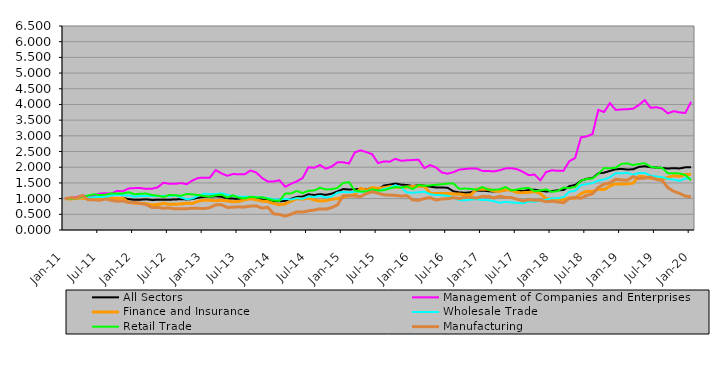
| Category | All Sectors | Management of Companies and Enterprises | Finance and Insurance | Wholesale Trade | Retail Trade | Manufacturing |
|---|---|---|---|---|---|---|
| 2011-01-01 | 1 | 1 | 1 | 1 | 1 | 1 |
| 2011-02-01 | 1.002 | 1.02 | 0.988 | 1.011 | 0.996 | 1.026 |
| 2011-03-01 | 1.011 | 1.051 | 1.008 | 1.012 | 1.012 | 1.017 |
| 2011-04-01 | 1.046 | 1.098 | 1.013 | 1.051 | 1.061 | 1.1 |
| 2011-05-01 | 1.016 | 1.076 | 0.989 | 1.028 | 1.096 | 0.963 |
| 2011-06-01 | 1.03 | 1.107 | 1.009 | 1.043 | 1.136 | 0.961 |
| 2011-07-01 | 1.03 | 1.16 | 0.998 | 1.056 | 1.114 | 0.945 |
| 2011-08-01 | 1.028 | 1.173 | 0.996 | 1.044 | 1.125 | 0.991 |
| 2011-09-01 | 1.021 | 1.157 | 1.015 | 1.102 | 1.164 | 0.946 |
| 2011-10-01 | 1.022 | 1.247 | 0.999 | 1.129 | 1.164 | 0.915 |
| 2011-11-01 | 1.022 | 1.233 | 1.011 | 1.105 | 1.163 | 0.927 |
| 2011-12-01 | 0.981 | 1.324 | 0.883 | 1.101 | 1.201 | 0.876 |
| 2012-01-01 | 0.963 | 1.335 | 0.855 | 1.065 | 1.138 | 0.88 |
| 2012-02-01 | 0.965 | 1.338 | 0.849 | 1.088 | 1.155 | 0.846 |
| 2012-03-01 | 0.977 | 1.31 | 0.836 | 1.084 | 1.161 | 0.815 |
| 2012-04-01 | 0.958 | 1.315 | 0.803 | 1.079 | 1.113 | 0.718 |
| 2012-05-01 | 0.962 | 1.359 | 0.811 | 1.081 | 1.096 | 0.722 |
| 2012-06-01 | 0.968 | 1.508 | 0.85 | 1.089 | 1.054 | 0.694 |
| 2012-07-01 | 0.964 | 1.473 | 0.817 | 1.077 | 1.116 | 0.704 |
| 2012-08-01 | 0.972 | 1.47 | 0.822 | 1.106 | 1.109 | 0.675 |
| 2012-09-01 | 0.982 | 1.495 | 0.827 | 1.04 | 1.091 | 0.679 |
| 2012-10-01 | 0.974 | 1.458 | 0.854 | 0.98 | 1.148 | 0.678 |
| 2012-11-01 | 0.987 | 1.577 | 0.846 | 1.004 | 1.136 | 0.694 |
| 2012-12-01 | 1.033 | 1.66 | 0.917 | 1.089 | 1.114 | 0.69 |
| 2013-01-01 | 1.055 | 1.664 | 0.949 | 1.158 | 1.083 | 0.681 |
| 2013-02-01 | 1.059 | 1.669 | 0.949 | 1.146 | 1.057 | 0.714 |
| 2013-03-01 | 1.077 | 1.91 | 0.93 | 1.148 | 1.105 | 0.8 |
| 2013-04-01 | 1.059 | 1.803 | 0.951 | 1.169 | 1.127 | 0.807 |
| 2013-05-01 | 1.009 | 1.727 | 0.926 | 1.125 | 1.036 | 0.718 |
| 2013-06-01 | 1.001 | 1.785 | 0.896 | 1.08 | 1.105 | 0.727 |
| 2013-07-01 | 0.992 | 1.774 | 0.907 | 1.064 | 1.029 | 0.738 |
| 2013-08-01 | 1.006 | 1.773 | 0.961 | 1.057 | 1.006 | 0.733 |
| 2013-09-01 | 1.036 | 1.897 | 0.993 | 1.059 | 1.056 | 0.762 |
| 2013-10-01 | 1.017 | 1.832 | 0.965 | 1.049 | 1.037 | 0.769 |
| 2013-11-01 | 0.979 | 1.658 | 0.918 | 1.036 | 1.043 | 0.698 |
| 2013-12-01 | 0.966 | 1.541 | 0.908 | 1.014 | 0.993 | 0.725 |
| 2014-01-01 | 0.914 | 1.544 | 0.844 | 0.976 | 0.939 | 0.516 |
| 2014-02-01 | 0.912 | 1.586 | 0.802 | 0.966 | 0.925 | 0.495 |
| 2014-03-01 | 0.93 | 1.376 | 0.832 | 0.991 | 1.159 | 0.442 |
| 2014-04-01 | 0.993 | 1.472 | 0.921 | 0.972 | 1.166 | 0.501 |
| 2014-05-01 | 1.054 | 1.55 | 1.001 | 1.015 | 1.244 | 0.578 |
| 2014-06-01 | 1.065 | 1.656 | 0.98 | 0.994 | 1.176 | 0.571 |
| 2014-07-01 | 1.138 | 1.998 | 1.023 | 1.067 | 1.251 | 0.612 |
| 2014-08-01 | 1.114 | 1.983 | 0.956 | 1.055 | 1.257 | 0.635 |
| 2014-09-01 | 1.142 | 2.071 | 0.923 | 1.09 | 1.345 | 0.674 |
| 2014-10-01 | 1.12 | 1.951 | 0.935 | 1.035 | 1.293 | 0.664 |
| 2014-11-01 | 1.156 | 2.021 | 0.98 | 1.066 | 1.298 | 0.714 |
| 2014-12-01 | 1.227 | 2.156 | 0.999 | 1.192 | 1.341 | 0.802 |
| 2015-01-01 | 1.305 | 2.157 | 1.047 | 1.213 | 1.502 | 1.092 |
| 2015-02-01 | 1.29 | 2.118 | 1.088 | 1.202 | 1.522 | 1.096 |
| 2015-03-01 | 1.299 | 2.473 | 1.129 | 1.22 | 1.26 | 1.084 |
| 2015-04-01 | 1.308 | 2.539 | 1.325 | 1.216 | 1.229 | 1.064 |
| 2015-05-01 | 1.301 | 2.483 | 1.272 | 1.234 | 1.222 | 1.162 |
| 2015-06-01 | 1.338 | 2.414 | 1.353 | 1.275 | 1.297 | 1.218 |
| 2015-07-01 | 1.29 | 2.132 | 1.329 | 1.24 | 1.259 | 1.176 |
| 2015-08-01 | 1.417 | 2.185 | 1.346 | 1.307 | 1.265 | 1.12 |
| 2015-09-01 | 1.444 | 2.176 | 1.381 | 1.346 | 1.321 | 1.114 |
| 2015-10-01 | 1.479 | 2.267 | 1.371 | 1.427 | 1.367 | 1.102 |
| 2015-11-01 | 1.446 | 2.205 | 1.349 | 1.351 | 1.354 | 1.083 |
| 2015-12-01 | 1.433 | 2.221 | 1.369 | 1.194 | 1.387 | 1.091 |
| 2016-01-01 | 1.4 | 2.229 | 1.387 | 1.188 | 1.302 | 0.956 |
| 2016-02-01 | 1.429 | 2.24 | 1.393 | 1.203 | 1.431 | 0.948 |
| 2016-03-01 | 1.413 | 1.973 | 1.39 | 1.219 | 1.407 | 1.003 |
| 2016-04-01 | 1.379 | 2.07 | 1.171 | 1.143 | 1.423 | 1.033 |
| 2016-05-01 | 1.356 | 1.992 | 1.159 | 1.113 | 1.44 | 0.954 |
| 2016-06-01 | 1.354 | 1.834 | 1.165 | 1.11 | 1.457 | 0.989 |
| 2016-07-01 | 1.348 | 1.793 | 1.166 | 1.091 | 1.478 | 0.998 |
| 2016-08-01 | 1.233 | 1.841 | 1.149 | 1.035 | 1.482 | 1.031 |
| 2016-09-01 | 1.197 | 1.923 | 1.148 | 0.957 | 1.312 | 1.002 |
| 2016-10-01 | 1.185 | 1.944 | 1.119 | 0.945 | 1.321 | 1.043 |
| 2016-11-01 | 1.201 | 1.962 | 1.118 | 0.969 | 1.309 | 1.039 |
| 2016-12-01 | 1.255 | 1.958 | 1.301 | 0.983 | 1.285 | 1.018 |
| 2017-01-01 | 1.254 | 1.882 | 1.299 | 0.953 | 1.37 | 1.072 |
| 2017-02-01 | 1.238 | 1.881 | 1.296 | 0.952 | 1.288 | 1.07 |
| 2017-03-01 | 1.223 | 1.866 | 1.24 | 0.918 | 1.28 | 1.021 |
| 2017-04-01 | 1.246 | 1.905 | 1.232 | 0.868 | 1.296 | 1.076 |
| 2017-05-01 | 1.271 | 1.963 | 1.278 | 0.898 | 1.368 | 1.039 |
| 2017-06-01 | 1.278 | 1.97 | 1.264 | 0.879 | 1.262 | 1.033 |
| 2017-07-01 | 1.248 | 1.936 | 1.191 | 0.865 | 1.287 | 0.98 |
| 2017-08-01 | 1.238 | 1.851 | 1.19 | 0.853 | 1.329 | 0.925 |
| 2017-09-01 | 1.276 | 1.746 | 1.199 | 0.906 | 1.341 | 0.962 |
| 2017-10-01 | 1.284 | 1.768 | 1.226 | 0.902 | 1.234 | 0.945 |
| 2017-11-01 | 1.252 | 1.584 | 1.157 | 0.924 | 1.259 | 0.95 |
| 2017-12-01 | 1.226 | 1.847 | 0.996 | 0.963 | 1.294 | 0.901 |
| 2018-01-01 | 1.24 | 1.902 | 0.991 | 1.013 | 1.214 | 0.917 |
| 2018-02-01 | 1.266 | 1.884 | 0.981 | 1.008 | 1.244 | 0.893 |
| 2018-03-01 | 1.273 | 1.891 | 0.969 | 1.048 | 1.351 | 0.866 |
| 2018-04-01 | 1.398 | 2.193 | 1.017 | 1.219 | 1.336 | 1.009 |
| 2018-05-01 | 1.434 | 2.295 | 1.011 | 1.248 | 1.373 | 1.035 |
| 2018-06-01 | 1.567 | 2.952 | 1.158 | 1.425 | 1.57 | 1.011 |
| 2018-07-01 | 1.632 | 2.982 | 1.23 | 1.464 | 1.628 | 1.101 |
| 2018-08-01 | 1.656 | 3.059 | 1.227 | 1.495 | 1.641 | 1.153 |
| 2018-09-01 | 1.804 | 3.826 | 1.296 | 1.578 | 1.786 | 1.357 |
| 2018-10-01 | 1.828 | 3.758 | 1.289 | 1.61 | 1.974 | 1.464 |
| 2018-11-01 | 1.883 | 4.041 | 1.402 | 1.679 | 1.967 | 1.503 |
| 2018-12-01 | 1.935 | 3.825 | 1.471 | 1.809 | 1.985 | 1.617 |
| 2019-01-01 | 1.946 | 3.842 | 1.462 | 1.805 | 2.105 | 1.594 |
| 2019-02-01 | 1.927 | 3.848 | 1.467 | 1.821 | 2.124 | 1.587 |
| 2019-03-01 | 1.935 | 3.866 | 1.497 | 1.758 | 2.069 | 1.7 |
| 2019-04-01 | 2.011 | 3.984 | 1.704 | 1.819 | 2.104 | 1.641 |
| 2019-05-01 | 2.03 | 4.14 | 1.697 | 1.819 | 2.129 | 1.651 |
| 2019-06-01 | 2.003 | 3.896 | 1.647 | 1.73 | 2.017 | 1.689 |
| 2019-07-01 | 1.991 | 3.911 | 1.652 | 1.704 | 1.987 | 1.608 |
| 2019-08-01 | 1.977 | 3.868 | 1.626 | 1.684 | 1.98 | 1.582 |
| 2019-09-01 | 1.959 | 3.717 | 1.675 | 1.629 | 1.808 | 1.348 |
| 2019-10-01 | 1.97 | 3.786 | 1.73 | 1.607 | 1.811 | 1.233 |
| 2019-11-01 | 1.961 | 3.747 | 1.709 | 1.565 | 1.802 | 1.166 |
| 2019-12-01 | 1.996 | 3.73 | 1.771 | 1.643 | 1.749 | 1.081 |
| 2020-01-01 | 2.004 | 4.086 | 1.77 | 1.643 | 1.589 | 1.059 |